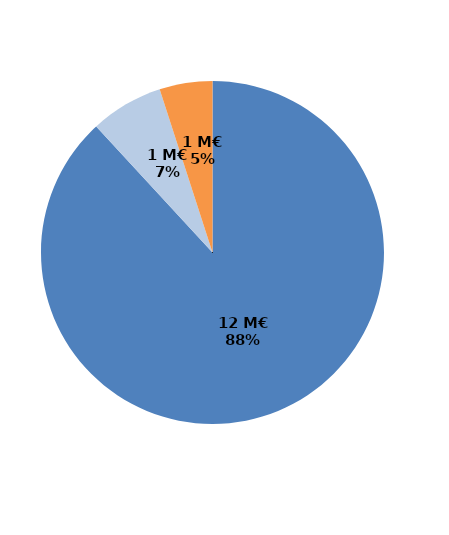
| Category | Series 0 |
|---|---|
| Formations certifiantes et pré-certifiantes | 12.429 |
| Formations professionnalisantes | 0.969 |
| Formations d'insertion sociale et professionnelle | 0.703 |